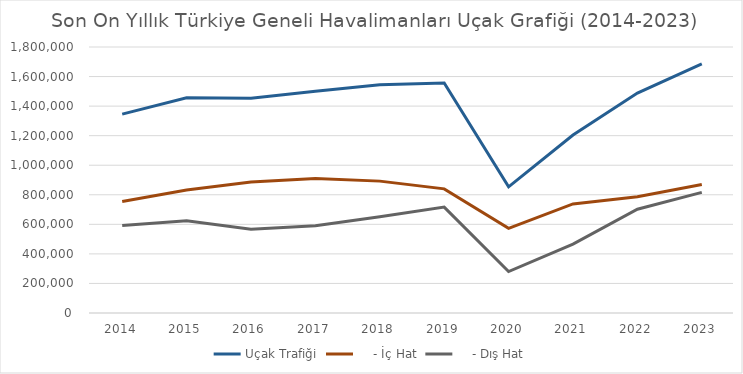
| Category | Uçak Trafiği |     - İç Hat |     - Dış Hat |
|---|---|---|---|
| 2014.0 | 1345954 | 754259 | 591695 |
| 2015.0 | 1456673 | 832958 | 623715 |
| 2016.0 | 1452995 | 886228 | 566767 |
| 2017.0 | 1500457 | 909332 | 591125 |
| 2018.0 | 1544169 | 892405 | 651764 |
| 2019.0 | 1556417 | 839894 | 716523 |
| 2020.0 | 853750 | 572994 | 280756 |
| 2021.0 | 1204618 | 738352 | 466266 |
| 2022.0 | 1488626 | 786150 | 702476 |
| 2023.0 | 1685877 | 869404 | 816473 |